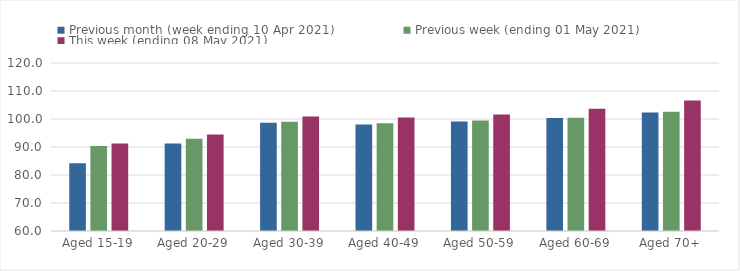
| Category | Previous month (week ending 10 Apr 2021) | Previous week (ending 01 May 2021) | This week (ending 08 May 2021) |
|---|---|---|---|
| Aged 15-19 | 84.19 | 90.37 | 91.25 |
| Aged 20-29 | 91.23 | 92.96 | 94.45 |
| Aged 30-39 | 98.65 | 99.01 | 100.86 |
| Aged 40-49 | 98.06 | 98.45 | 100.54 |
| Aged 50-59 | 99.14 | 99.5 | 101.63 |
| Aged 60-69 | 100.4 | 100.49 | 103.66 |
| Aged 70+ | 102.29 | 102.58 | 106.57 |